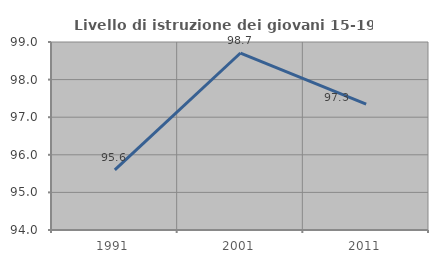
| Category | Livello di istruzione dei giovani 15-19 anni |
|---|---|
| 1991.0 | 95.597 |
| 2001.0 | 98.707 |
| 2011.0 | 97.348 |